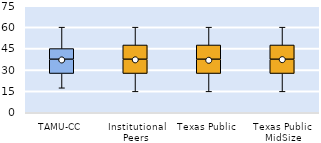
| Category | 25th | 50th | 75th |
|---|---|---|---|
| TAMU-CC | 27.5 | 10 | 7.5 |
| Institutional Peers | 27.5 | 10 | 10 |
| Texas Public | 27.5 | 10 | 10 |
| Texas Public MidSize | 27.5 | 10 | 10 |